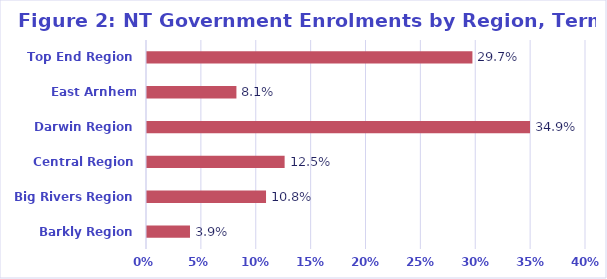
| Category | % |
|---|---|
| Barkly Region | 0.039 |
| Big Rivers Region | 0.108 |
| Central Region | 0.125 |
| Darwin Region | 0.349 |
| East Arnhem Region | 0.081 |
| Top End Region | 0.297 |